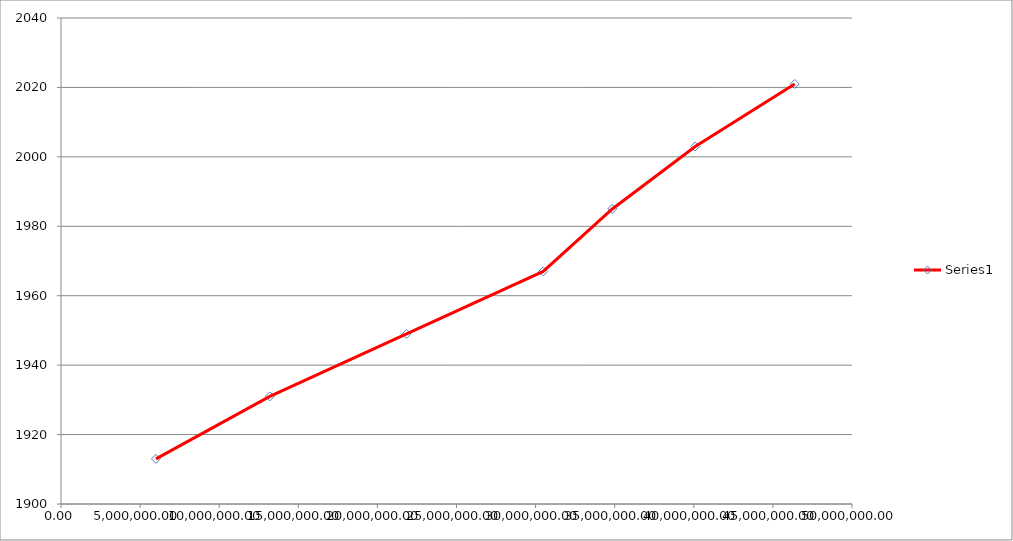
| Category | Series 0 |
|---|---|
| 6000000.0 | 1913 |
| 13200000.0 | 1931 |
| 21840000.0 | 1949 |
| 30480000.0 | 1967 |
| 34848000.0 | 1985 |
| 40089600.0 | 2003 |
| 46379520.0 | 2021 |